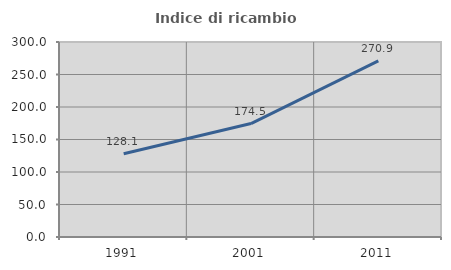
| Category | Indice di ricambio occupazionale  |
|---|---|
| 1991.0 | 128.147 |
| 2001.0 | 174.55 |
| 2011.0 | 270.933 |